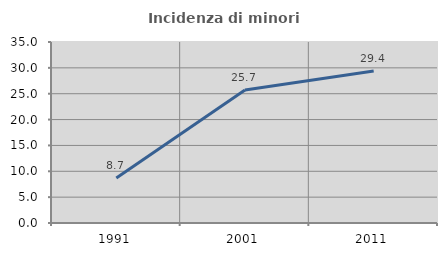
| Category | Incidenza di minori stranieri |
|---|---|
| 1991.0 | 8.696 |
| 2001.0 | 25.731 |
| 2011.0 | 29.381 |